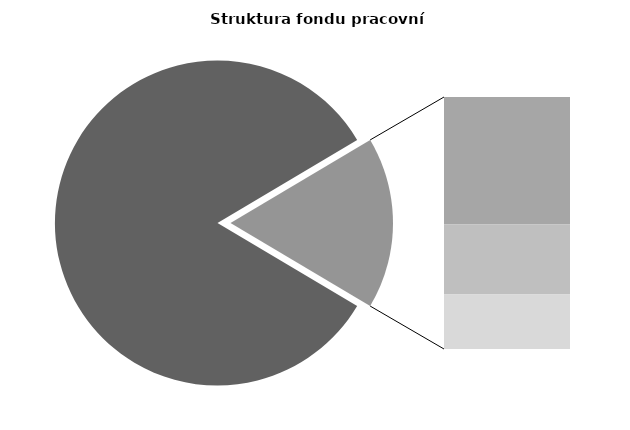
| Category | Series 0 |
|---|---|
| Průměrná měsíční odpracovaná doba bez přesčasu | 141.596 |
| Dovolená | 14.764 |
| Nemoc | 8.085 |
| Jiné | 6.32 |